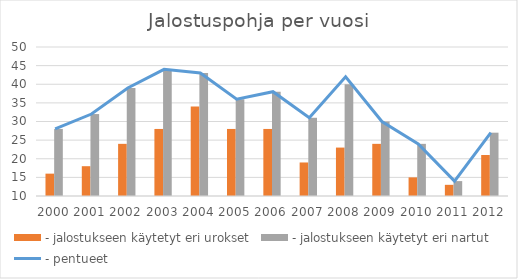
| Category | - jalostukseen käytetyt eri urokset | - jalostukseen käytetyt eri nartut |
|---|---|---|
| 2000.0 | 16 | 28 |
| 2001.0 | 18 | 32 |
| 2002.0 | 24 | 39 |
| 2003.0 | 28 | 44 |
| 2004.0 | 34 | 43 |
| 2005.0 | 28 | 36 |
| 2006.0 | 28 | 38 |
| 2007.0 | 19 | 31 |
| 2008.0 | 23 | 40 |
| 2009.0 | 24 | 30 |
| 2010.0 | 15 | 24 |
| 2011.0 | 13 | 14 |
| 2012.0 | 21 | 27 |